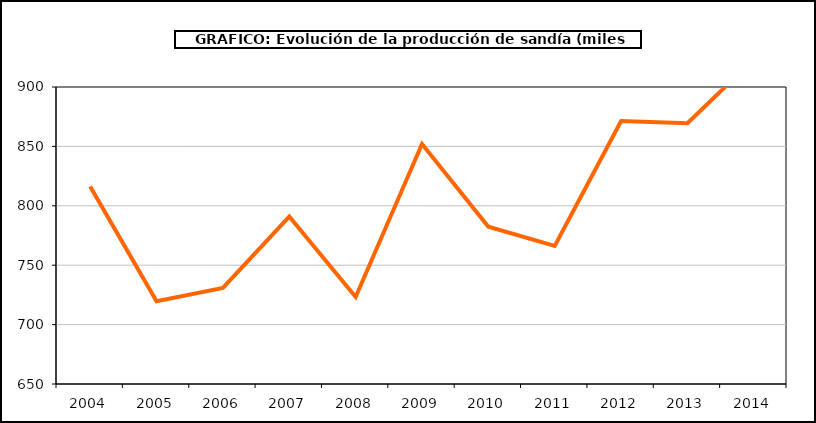
| Category | producción |
|---|---|
| 2004.0 | 816.208 |
| 2005.0 | 719.621 |
| 2006.0 | 730.902 |
| 2007.0 | 790.947 |
| 2008.0 | 723.164 |
| 2009.0 | 851.976 |
| 2010.0 | 782.43 |
| 2011.0 | 766.301 |
| 2012.0 | 871.324 |
| 2013.0 | 869.499 |
| 2014.0 | 923.32 |